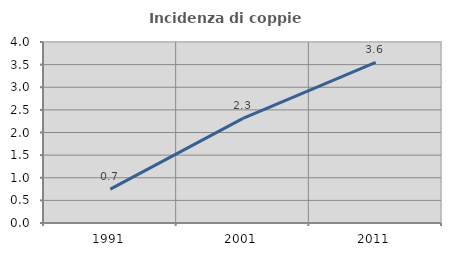
| Category | Incidenza di coppie miste |
|---|---|
| 1991.0 | 0.748 |
| 2001.0 | 2.312 |
| 2011.0 | 3.552 |